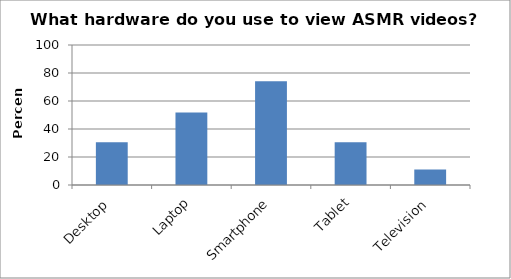
| Category | % of respondents |
|---|---|
| Desktop | 30.556 |
| Laptop | 51.852 |
| Smartphone | 74.074 |
| Tablet | 30.556 |
| Television | 11.111 |